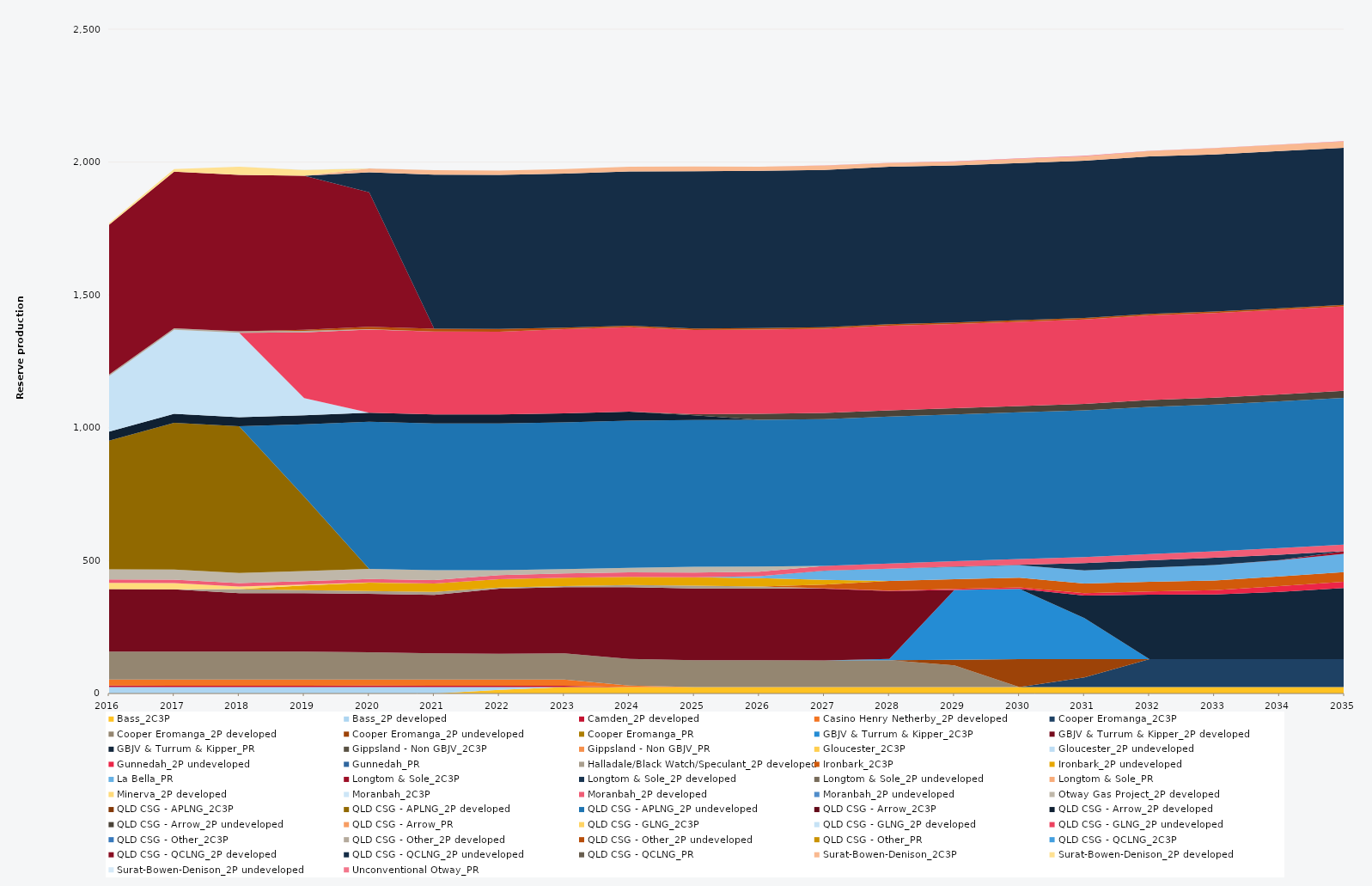
| Category | Bass_2C3P | Bass_2P developed | Camden_2P developed | Casino Henry Netherby_2P developed | Cooper Eromanga_2C3P | Cooper Eromanga_2P developed | Cooper Eromanga_2P undeveloped | Cooper Eromanga_PR | GBJV & Turrum & Kipper_2C3P | GBJV & Turrum & Kipper_2P developed | GBJV & Turrum & Kipper_PR | Gippsland - Non GBJV_2C3P | Gippsland - Non GBJV_PR | Gloucester_2C3P | Gloucester_2P undeveloped | Gunnedah_2P undeveloped | Gunnedah_PR | Halladale/Black Watch/Speculant_2P developed | Ironbark_2C3P | Ironbark_2P undeveloped | La Bella_PR | Longtom & Sole_2C3P | Longtom & Sole_2P developed | Longtom & Sole_2P undeveloped | Longtom & Sole_PR | Minerva_2P developed | Moranbah_2C3P | Moranbah_2P developed | Moranbah_2P undeveloped | Otway Gas Project_2P developed | QLD CSG - APLNG_2C3P | QLD CSG - APLNG_2P developed | QLD CSG - APLNG_2P undeveloped | QLD CSG - Arrow_2C3P | QLD CSG - Arrow_2P developed | QLD CSG - Arrow_2P undeveloped | QLD CSG - Arrow_PR | QLD CSG - GLNG_2C3P | QLD CSG - GLNG_2P developed | QLD CSG - GLNG_2P undeveloped | QLD CSG - Other_2C3P | QLD CSG - Other_2P developed | QLD CSG - Other_2P undeveloped | QLD CSG - Other_PR | QLD CSG - QCLNG_2C3P | QLD CSG - QCLNG_2P developed | QLD CSG - QCLNG_2P undeveloped | QLD CSG - QCLNG_PR | Surat-Bowen-Denison_2C3P | Surat-Bowen-Denison_2P developed | Surat-Bowen-Denison_2P undeveloped | Unconventional Otway_PR |
|---|---|---|---|---|---|---|---|---|---|---|---|---|---|---|---|---|---|---|---|---|---|---|---|---|---|---|---|---|---|---|---|---|---|---|---|---|---|---|---|---|---|---|---|---|---|---|---|---|---|---|---|---|
| 2016 | 0 | 24.522 | 5 | 23.12 | 0 | 105 | 0 | 0 | 0 | 235.041 | 0 | 0 | 0 | 0 | 0 | 0 | 0 | 0 | 0 | 0 | 0 | 0 | 0 | 0 | 0 | 23.79 | 0 | 12.867 | 0 | 38 | 0 | 484.599 | 0 | 0 | 34.038 | 0 | 0 | 0 | 208.948 | 0 | 0 | 5.856 | 0 | 0 | 0 | 563.525 | 0 | 0 | 0 | 5.979 | 0 | 0 |
| 2017 | 0 | 24.455 | 5 | 23.12 | 0 | 105 | 0 | 0 | 0 | 234.628 | 0 | 0 | 0 | 0 | 0 | 0 | 0 | 0 | 0 | 0 | 0 | 0 | 0 | 0 | 0 | 23.725 | 0 | 12.873 | 0 | 38 | 0 | 552.245 | 0 | 0 | 33.945 | 0 | 0 | 0 | 315.713 | 0 | 0 | 5.84 | 0 | 0 | 0 | 589.464 | 0 | 0 | 0 | 9.604 | 0 | 0 |
| 2018 | 0 | 24.455 | 5 | 23.12 | 0 | 105 | 0 | 0 | 0 | 220 | 0 | 0 | 0 | 0 | 0 | 0 | 0 | 15.424 | 0 | 0 | 0 | 0 | 0 | 0 | 0 | 9.373 | 0 | 13.04 | 0 | 38 | 0 | 552.245 | 0 | 0 | 33.945 | 0 | 0 | 0 | 317.886 | 0 | 0 | 5.84 | 0 | 0 | 0 | 588.841 | 0 | 0 | 0 | 30 | 0 | 0 |
| 2019 | 0 | 24.455 | 5 | 23.12 | 0 | 105 | 0 | 0 | 0 | 220 | 0 | 0 | 0 | 0 | 0 | 0 | 0 | 10.95 | 0 | 18.249 | 0 | 0 | 0 | 0 | 0 | 3.025 | 0 | 12.81 | 0 | 38 | 0 | 280.461 | 271.784 | 0 | 33.945 | 0 | 0 | 0 | 64.753 | 247.277 | 0 | 5.84 | 4.563 | 0 | 0 | 579.675 | 0 | 0 | 0 | 21.232 | 1.088 | 0 |
| 2020 | 0 | 24.522 | 5 | 23.12 | 0 | 102.21 | 0 | 0 | 0 | 220 | 0 | 0 | 0 | 0 | 0 | 0 | 0 | 10.95 | 0 | 31.573 | 0 | 0 | 0 | 0 | 0 | 0.837 | 0 | 12.781 | 0 | 38 | 0 | 0 | 553.758 | 0 | 34.038 | 0 | 0 | 0 | 0 | 312.817 | 0 | 1.624 | 8.795 | 0 | 0 | 505.894 | 75.509 | 0 | 14.32 | 0 | 0.912 | 0 |
| 2021 | 0 | 24.455 | 5 | 23.12 | 0 | 98.743 | 0 | 0 | 0 | 220 | 0 | 0 | 0 | 0 | 0 | 0 | 0 | 10.95 | 0 | 31.496 | 0 | 0 | 0 | 0 | 0 | 0 | 0 | 13.533 | 0 | 36.99 | 0 | 0 | 552.245 | 0 | 33.945 | 0 | 0 | 0 | 0 | 311.959 | 0 | 0 | 10.403 | 0 | 0 | 0 | 580.101 | 0 | 16.54 | 0 | 0 | 0 |
| 2022 | 13.672 | 10.783 | 5 | 23.12 | 0 | 97.216 | 0 | 0 | 0 | 244.607 | 0 | 0 | 0 | 0 | 0 | 0 | 0 | 4.347 | 0 | 31.377 | 0 | 0 | 0 | 0 | 0 | 0 | 0 | 15.298 | 0 | 18.298 | 0 | 0 | 552.245 | 0 | 33.945 | 0 | 0 | 0 | 0 | 311.898 | 0 | 0 | 10.403 | 0 | 0 | 0 | 579.606 | 0 | 16.263 | 0 | 0 | 0 |
| 2023 | 24.455 | 0 | 5 | 23.12 | 0 | 98.292 | 0 | 0 | 0 | 249.161 | 0 | 0 | 0 | 0 | 0 | 0 | 0 | 4.519 | 0 | 31.367 | 0 | 0 | 0 | 0 | 0 | 0 | 0 | 16.264 | 0 | 16.35 | 0 | 0 | 552.245 | 0 | 33.945 | 0 | 0 | 0 | 0 | 316.625 | 0 | 0 | 5.84 | 0 | 0 | 0 | 579.587 | 0 | 16.761 | 0 | 0 | 0 |
| 2024 | 24.522 | 0 | 0 | 5.3 | 0 | 100.02 | 0 | 0 | 0 | 270 | 0 | 0 | 0 | 0 | 0 | 0 | 0 | 8.12 | 0 | 31.053 | 0 | 0 | 0 | 0 | 0 | 0 | 0 | 16.79 | 0 | 17.514 | 0 | 0 | 553.758 | 0 | 34.038 | 0 | 0 | 0 | 0 | 317.359 | 0 | 0 | 5.856 | 0 | 0 | 0 | 580.592 | 0 | 17.244 | 0 | 0 | 0 |
| 2025 | 24.455 | 0 | 0 | 0 | 0 | 101.039 | 0 | 0 | 0 | 270 | 0 | 0 | 0 | 0 | 0 | 0.275 | 0 | 10.052 | 0 | 31.983 | 0 | 0 | 0 | 0 | 0 | 0 | 0 | 17.268 | 0 | 21.696 | 0 | 0 | 552.245 | 0 | 18.166 | 3.869 | 0 | 0 | 0 | 316.795 | 0 | 0 | 5.84 | 0 | 0 | 0 | 591.794 | 0 | 17.815 | 0 | 0 | 0 |
| 2026 | 24.455 | 0 | 0 | 0 | 0 | 100.577 | 0 | 0 | 0 | 270 | 0 | 0 | 0 | 0 | 0 | 0.643 | 0 | 6.688 | 0 | 31.544 | 7.196 | 0 | 0.185 | 0 | 0 | 0 | 0 | 17.518 | 0 | 18.757 | 0 | 0 | 552.245 | 0 | 0 | 22.841 | 0 | 0 | 0 | 316.693 | 0 | 0 | 5.84 | 0 | 0 | 0 | 591.753 | 0 | 15.987 | 0 | 0 | 0 |
| 2027 | 24.455 | 0 | 0 | 0 | 0 | 100.324 | 0 | 0 | 0 | 270 | 0 | 0 | 0 | 0 | 0 | 1.192 | 0 | 0 | 14.294 | 17.358 | 34.358 | 0 | 0.225 | 0 | 0 | 0 | 0 | 18.14 | 0 | 0 | 0 | 0 | 552.245 | 0 | 0 | 23.131 | 0 | 0 | 0 | 316.854 | 0 | 0 | 5.84 | 0 | 0 | 0 | 591.693 | 0 | 16.42 | 0 | 0 | 0.682 |
| 2028 | 24.522 | 0 | 0 | 0 | 0 | 100.725 | 0 | 0 | 4.931 | 255.67 | 0 | 0 | 0 | 0 | 0 | 1.793 | 0 | 0 | 35.776 | 0 | 46.146 | 0 | 0.21 | 0 | 0 | 0 | 0 | 18.99 | 0 | 0 | 0 | 0 | 553.758 | 0 | 0 | 23.47 | 0 | 0 | 0 | 317.828 | 0 | 0 | 5.856 | 0 | 0 | 0 | 593.234 | 0 | 13.201 | 0 | 0 | 1.067 |
| 2029 | 24.455 | 0 | 0 | 0 | 0 | 81.854 | 20.894 | 0 | 262.268 | 0 | 0 | 0 | 0 | 0 | 0 | 4.122 | 0 | 0 | 36.5 | 0 | 45.82 | 0 | 1.542 | 0 | 0 | 0 | 0 | 20.344 | 0 | 0 | 0 | 0 | 552.245 | 0 | 0 | 23.353 | 0 | 0 | 0 | 316.897 | 0 | 0 | 5.84 | 0 | 0 | 0 | 591.622 | 0 | 13.566 | 0 | 0 | 1.193 |
| 2030 | 24.455 | 0 | 0 | 0 | 0 | 0 | 105 | 0 | 263.968 | 0 | 0 | 0 | 0 | 0 | 0 | 5.678 | 0 | 0 | 36.5 | 0 | 47.223 | 0 | 1.547 | 0 | 0 | 0 | 0 | 21.608 | 0 | 0 | 0 | 0 | 552.245 | 0 | 0 | 23.602 | 0 | 0 | 0 | 317.279 | 0 | 0 | 5.84 | 0 | 0 | 0 | 591.579 | 0 | 16.215 | 0 | 0 | 1.34 |
| 2031 | 24.455 | 0 | 0 | 0 | 36.312 | 0 | 68.688 | 0 | 154.547 | 0 | 84.821 | 0 | 0 | 0 | 0 | 8.791 | 0 | 0 | 36.5 | 0 | 49.535 | 0 | 27.375 | 0 | 0 | 0 | 0 | 22.555 | 0 | 0 | 0 | 0 | 552.245 | 0 | 0 | 24.176 | 0 | 0 | 0 | 317.559 | 0 | 0 | 5.84 | 0 | 0 | 0 | 591.53 | 0 | 16.708 | 0 | 0 | 2.148 |
| 2032 | 24.522 | 0 | 0 | 0 | 105 | 0 | 0 | 0 | 0 | 0 | 242.17 | 0 | 0 | 0 | 0 | 12.385 | 0 | 0 | 36.6 | 0 | 53.491 | 0 | 27.45 | 0 | 0 | 0 | 0 | 23.473 | 0 | 0 | 0 | 0 | 553.758 | 0 | 0 | 25.27 | 0 | 0 | 0 | 318.687 | 0 | 0 | 5.856 | 0 | 0 | 0 | 593.07 | 0 | 19.731 | 0 | 0 | 1.151 |
| 2033 | 24.455 | 0 | 0 | 0 | 105 | 0 | 0 | 0 | 0 | 0 | 243.571 | 0 | 0 | 0 | 0 | 16.12 | 0 | 0 | 36.5 | 0 | 57.881 | 0 | 27.375 | 0 | 0 | 0 | 0 | 23.984 | 0 | 0 | 0 | 0 | 552.245 | 0 | 0 | 26.292 | 0 | 0 | 0 | 318.155 | 0 | 0 | 5.84 | 0 | 0 | 0 | 591.435 | 0 | 22.843 | 0 | 0 | 0.911 |
| 2034 | 24.455 | 0 | 0 | 0 | 105 | 0 | 0 | 0 | 0 | 0 | 253.196 | 0 | 0 | 0 | 0 | 21.43 | 0 | 0 | 36.5 | 0 | 60.903 | 0.525 | 20.571 | 0 | 0 | 0 | 0 | 24.559 | 0 | 0 | 0 | 0 | 552.245 | 0 | 0 | 26.478 | 0 | 0 | 0 | 318.338 | 0 | 0 | 5.84 | 0 | 0 | 0 | 591.394 | 0 | 23.555 | 0 | 0 | 1.147 |
| 2035 | 24.455 | 0 | 0 | 0 | 105 | 0 | 0 | 0 | 0 | 0 | 267.803 | 0 | 0 | 0 | 0 | 23.533 | 0 | 0 | 36.5 | 0 | 68.719 | 9.85 | 0 | 0 | 0 | 0 | 0 | 24.812 | 0 | 0 | 0 | 0 | 552.245 | 0 | 0 | 26.393 | 0 | 0 | 0 | 317.822 | 0 | 0 | 5.84 | 0 | 0 | 0 | 591.053 | 0 | 23.532 | 0 | 0 | 1.362 |